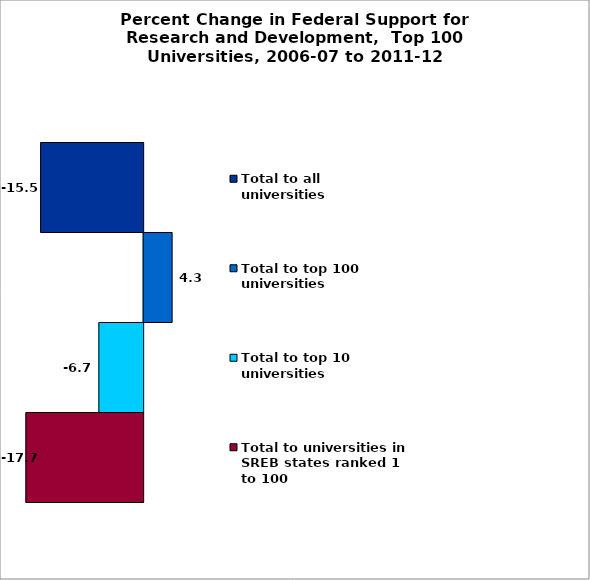
| Category | Total to universities in SREB states ranked 1 to 100 | Total to top 10 universities | Total to top 100 universities | Total to all universities |
|---|---|---|---|---|
| 0 | -17.675 | -6.677 | 4.292 | -15.452 |